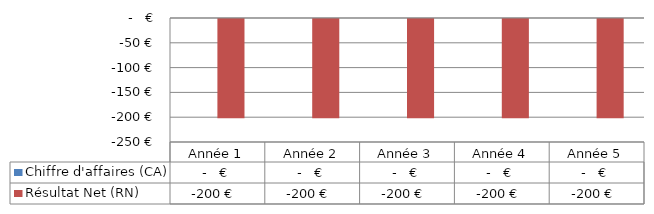
| Category | Chiffre d'affaires (CA) | Résultat Net (RN) |
|---|---|---|
| Année 1 | 0 | -200 |
| Année 2 | 0 | -200 |
| Année 3 | 0 | -200 |
| Année 4 | 0 | -200 |
| Année 5 | 0 | -200 |